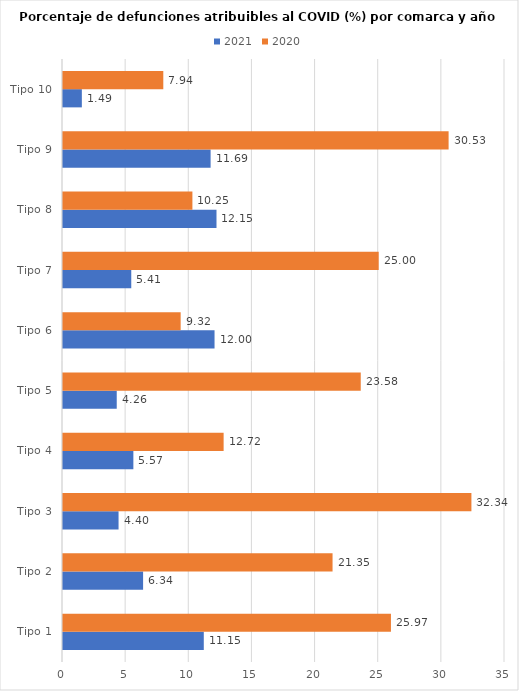
| Category | 2021 | 2020 |
|---|---|---|
| Tipo 1 | 11.149 | 25.969 |
| Tipo 2 | 6.342 | 21.345 |
| Tipo 3 | 4.399 | 32.34 |
| Tipo 4 | 5.572 | 12.719 |
| Tipo 5 | 4.255 | 23.577 |
| Tipo 6 | 12 | 9.317 |
| Tipo 7 | 5.405 | 25 |
| Tipo 8 | 12.155 | 10.247 |
| Tipo 9 | 11.688 | 30.534 |
| Tipo 10 | 1.493 | 7.942 |